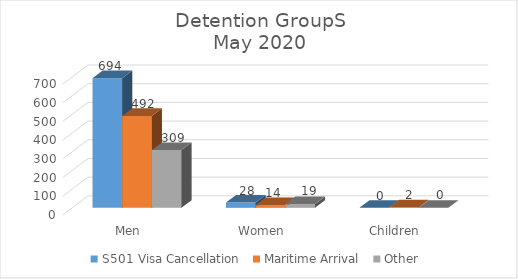
| Category | S501 Visa Cancellation  | Maritime Arrival  | Other  |
|---|---|---|---|
| Men | 694 | 492 | 309 |
| Women | 28 | 14 | 19 |
| Children | 0 | 2 | 0 |